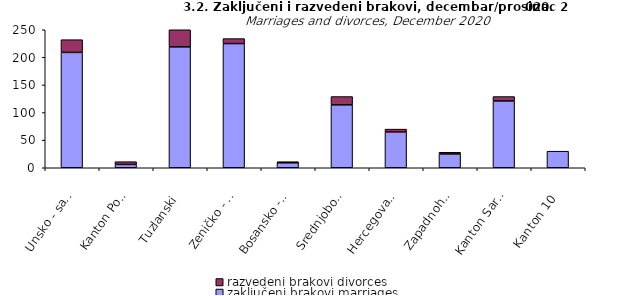
| Category | zaključeni brakovi marriages | razvedeni brakovi divorces |
|---|---|---|
| Unsko - sanski | 209 | 23 |
| Kanton Posavski | 6 | 5 |
| Tuzlanski | 219 | 46 |
| Zeničko - dobojski | 225 | 9 |
| Bosansko - podrinjski | 9 | 2 |
| Srednjobosanski | 114 | 15 |
| Hercegovačko-neretvanski | 65 | 5 |
| Zapadnohercegovački | 25 | 3 |
| Kanton Sarajevo | 121 | 8 |
| Kanton 10 | 30 | 0 |